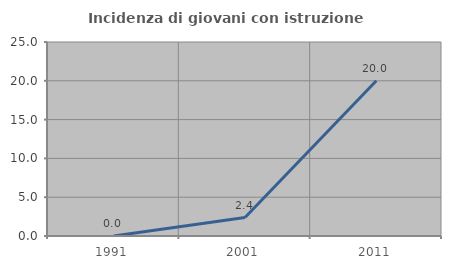
| Category | Incidenza di giovani con istruzione universitaria |
|---|---|
| 1991.0 | 0 |
| 2001.0 | 2.381 |
| 2011.0 | 20 |